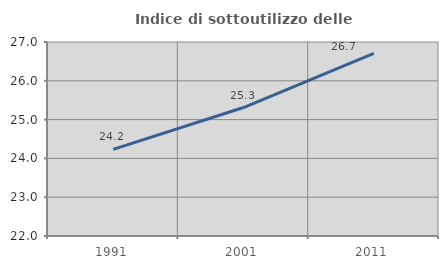
| Category | Indice di sottoutilizzo delle abitazioni  |
|---|---|
| 1991.0 | 24.232 |
| 2001.0 | 25.311 |
| 2011.0 | 26.706 |